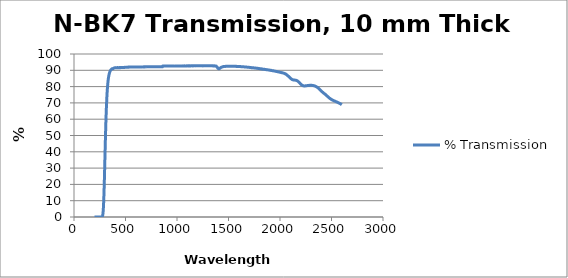
| Category | % Transmission |
|---|---|
| 2600.0 | 68.899 |
| 2599.0 | 68.944 |
| 2598.0 | 69.011 |
| 2597.0 | 69.037 |
| 2596.0 | 69.073 |
| 2595.0 | 69.112 |
| 2594.0 | 69.17 |
| 2593.0 | 69.196 |
| 2592.0 | 69.238 |
| 2591.0 | 69.243 |
| 2590.0 | 69.297 |
| 2589.0 | 69.358 |
| 2588.0 | 69.409 |
| 2587.0 | 69.429 |
| 2586.0 | 69.496 |
| 2585.0 | 69.52 |
| 2584.0 | 69.545 |
| 2583.0 | 69.556 |
| 2582.0 | 69.567 |
| 2581.0 | 69.654 |
| 2580.0 | 69.713 |
| 2579.0 | 69.743 |
| 2578.0 | 69.777 |
| 2577.0 | 69.791 |
| 2576.0 | 69.797 |
| 2575.0 | 69.844 |
| 2574.0 | 69.911 |
| 2573.0 | 69.915 |
| 2572.0 | 69.949 |
| 2571.0 | 69.978 |
| 2570.0 | 70.028 |
| 2569.0 | 70.069 |
| 2568.0 | 70.088 |
| 2567.0 | 70.12 |
| 2566.0 | 70.129 |
| 2565.0 | 70.155 |
| 2564.0 | 70.171 |
| 2563.0 | 70.21 |
| 2562.0 | 70.258 |
| 2561.0 | 70.281 |
| 2560.0 | 70.298 |
| 2559.0 | 70.32 |
| 2558.0 | 70.336 |
| 2557.0 | 70.367 |
| 2556.0 | 70.432 |
| 2555.0 | 70.452 |
| 2554.0 | 70.492 |
| 2553.0 | 70.54 |
| 2552.0 | 70.572 |
| 2551.0 | 70.587 |
| 2550.0 | 70.599 |
| 2549.0 | 70.648 |
| 2548.0 | 70.657 |
| 2547.0 | 70.681 |
| 2546.0 | 70.692 |
| 2545.0 | 70.735 |
| 2544.0 | 70.754 |
| 2543.0 | 70.807 |
| 2542.0 | 70.833 |
| 2541.0 | 70.86 |
| 2540.0 | 70.89 |
| 2539.0 | 70.928 |
| 2538.0 | 70.946 |
| 2537.0 | 70.984 |
| 2536.0 | 70.986 |
| 2535.0 | 70.996 |
| 2534.0 | 71.012 |
| 2533.0 | 71.074 |
| 2532.0 | 71.099 |
| 2531.0 | 71.144 |
| 2530.0 | 71.14 |
| 2529.0 | 71.148 |
| 2528.0 | 71.154 |
| 2527.0 | 71.216 |
| 2526.0 | 71.246 |
| 2525.0 | 71.287 |
| 2524.0 | 71.312 |
| 2523.0 | 71.324 |
| 2522.0 | 71.348 |
| 2521.0 | 71.401 |
| 2520.0 | 71.441 |
| 2519.0 | 71.459 |
| 2518.0 | 71.489 |
| 2517.0 | 71.504 |
| 2516.0 | 71.531 |
| 2515.0 | 71.567 |
| 2514.0 | 71.606 |
| 2513.0 | 71.631 |
| 2512.0 | 71.668 |
| 2511.0 | 71.688 |
| 2510.0 | 71.725 |
| 2509.0 | 71.755 |
| 2508.0 | 71.789 |
| 2507.0 | 71.819 |
| 2506.0 | 71.866 |
| 2505.0 | 71.917 |
| 2504.0 | 71.965 |
| 2503.0 | 71.998 |
| 2502.0 | 72.015 |
| 2501.0 | 72.044 |
| 2500.0 | 72.087 |
| 2499.0 | 72.117 |
| 2498.0 | 72.17 |
| 2497.0 | 72.187 |
| 2496.0 | 72.231 |
| 2495.0 | 72.28 |
| 2494.0 | 72.298 |
| 2493.0 | 72.361 |
| 2492.0 | 72.41 |
| 2491.0 | 72.463 |
| 2490.0 | 72.498 |
| 2489.0 | 72.529 |
| 2488.0 | 72.58 |
| 2487.0 | 72.635 |
| 2486.0 | 72.678 |
| 2485.0 | 72.712 |
| 2484.0 | 72.762 |
| 2483.0 | 72.806 |
| 2482.0 | 72.855 |
| 2481.0 | 72.91 |
| 2480.0 | 72.97 |
| 2479.0 | 73.017 |
| 2478.0 | 73.04 |
| 2477.0 | 73.088 |
| 2476.0 | 73.146 |
| 2475.0 | 73.208 |
| 2474.0 | 73.262 |
| 2473.0 | 73.314 |
| 2472.0 | 73.378 |
| 2471.0 | 73.419 |
| 2470.0 | 73.471 |
| 2469.0 | 73.541 |
| 2468.0 | 73.602 |
| 2467.0 | 73.673 |
| 2466.0 | 73.73 |
| 2465.0 | 73.771 |
| 2464.0 | 73.835 |
| 2463.0 | 73.905 |
| 2462.0 | 73.965 |
| 2461.0 | 74.02 |
| 2460.0 | 74.07 |
| 2459.0 | 74.114 |
| 2458.0 | 74.166 |
| 2457.0 | 74.227 |
| 2456.0 | 74.304 |
| 2455.0 | 74.383 |
| 2454.0 | 74.438 |
| 2453.0 | 74.484 |
| 2452.0 | 74.535 |
| 2451.0 | 74.593 |
| 2450.0 | 74.65 |
| 2449.0 | 74.7 |
| 2448.0 | 74.764 |
| 2447.0 | 74.812 |
| 2446.0 | 74.853 |
| 2445.0 | 74.915 |
| 2444.0 | 74.985 |
| 2443.0 | 75.031 |
| 2442.0 | 75.068 |
| 2441.0 | 75.124 |
| 2440.0 | 75.194 |
| 2439.0 | 75.266 |
| 2438.0 | 75.318 |
| 2437.0 | 75.351 |
| 2436.0 | 75.393 |
| 2435.0 | 75.438 |
| 2434.0 | 75.478 |
| 2433.0 | 75.524 |
| 2432.0 | 75.578 |
| 2431.0 | 75.641 |
| 2430.0 | 75.705 |
| 2429.0 | 75.772 |
| 2428.0 | 75.825 |
| 2427.0 | 75.852 |
| 2426.0 | 75.902 |
| 2425.0 | 75.98 |
| 2424.0 | 76.029 |
| 2423.0 | 76.059 |
| 2422.0 | 76.122 |
| 2421.0 | 76.188 |
| 2420.0 | 76.245 |
| 2419.0 | 76.29 |
| 2418.0 | 76.329 |
| 2417.0 | 76.385 |
| 2416.0 | 76.442 |
| 2415.0 | 76.51 |
| 2414.0 | 76.569 |
| 2413.0 | 76.609 |
| 2412.0 | 76.65 |
| 2411.0 | 76.703 |
| 2410.0 | 76.762 |
| 2409.0 | 76.827 |
| 2408.0 | 76.887 |
| 2407.0 | 76.945 |
| 2406.0 | 77.002 |
| 2405.0 | 77.059 |
| 2404.0 | 77.12 |
| 2403.0 | 77.175 |
| 2402.0 | 77.227 |
| 2401.0 | 77.286 |
| 2400.0 | 77.359 |
| 2399.0 | 77.431 |
| 2398.0 | 77.501 |
| 2397.0 | 77.559 |
| 2396.0 | 77.612 |
| 2395.0 | 77.674 |
| 2394.0 | 77.742 |
| 2393.0 | 77.811 |
| 2392.0 | 77.887 |
| 2391.0 | 77.966 |
| 2390.0 | 78.026 |
| 2389.0 | 78.071 |
| 2388.0 | 78.135 |
| 2387.0 | 78.202 |
| 2386.0 | 78.261 |
| 2385.0 | 78.317 |
| 2384.0 | 78.361 |
| 2383.0 | 78.422 |
| 2382.0 | 78.491 |
| 2381.0 | 78.569 |
| 2380.0 | 78.64 |
| 2379.0 | 78.7 |
| 2378.0 | 78.74 |
| 2377.0 | 78.778 |
| 2376.0 | 78.84 |
| 2375.0 | 78.927 |
| 2374.0 | 78.99 |
| 2373.0 | 79.04 |
| 2372.0 | 79.087 |
| 2371.0 | 79.136 |
| 2370.0 | 79.185 |
| 2369.0 | 79.235 |
| 2368.0 | 79.287 |
| 2367.0 | 79.325 |
| 2366.0 | 79.382 |
| 2365.0 | 79.444 |
| 2364.0 | 79.481 |
| 2363.0 | 79.506 |
| 2362.0 | 79.54 |
| 2361.0 | 79.584 |
| 2360.0 | 79.634 |
| 2359.0 | 79.674 |
| 2358.0 | 79.718 |
| 2357.0 | 79.763 |
| 2356.0 | 79.796 |
| 2355.0 | 79.82 |
| 2354.0 | 79.855 |
| 2353.0 | 79.907 |
| 2352.0 | 79.955 |
| 2351.0 | 79.988 |
| 2350.0 | 80.023 |
| 2349.0 | 80.073 |
| 2348.0 | 80.105 |
| 2347.0 | 80.14 |
| 2346.0 | 80.179 |
| 2345.0 | 80.191 |
| 2344.0 | 80.215 |
| 2343.0 | 80.239 |
| 2342.0 | 80.274 |
| 2341.0 | 80.311 |
| 2340.0 | 80.325 |
| 2339.0 | 80.332 |
| 2338.0 | 80.356 |
| 2337.0 | 80.395 |
| 2336.0 | 80.416 |
| 2335.0 | 80.446 |
| 2334.0 | 80.451 |
| 2333.0 | 80.459 |
| 2332.0 | 80.476 |
| 2331.0 | 80.507 |
| 2330.0 | 80.513 |
| 2329.0 | 80.538 |
| 2328.0 | 80.547 |
| 2327.0 | 80.562 |
| 2326.0 | 80.588 |
| 2325.0 | 80.601 |
| 2324.0 | 80.605 |
| 2323.0 | 80.622 |
| 2322.0 | 80.646 |
| 2321.0 | 80.638 |
| 2320.0 | 80.652 |
| 2319.0 | 80.664 |
| 2318.0 | 80.681 |
| 2317.0 | 80.7 |
| 2316.0 | 80.701 |
| 2315.0 | 80.708 |
| 2314.0 | 80.712 |
| 2313.0 | 80.728 |
| 2312.0 | 80.743 |
| 2311.0 | 80.762 |
| 2310.0 | 80.774 |
| 2309.0 | 80.788 |
| 2308.0 | 80.778 |
| 2307.0 | 80.778 |
| 2306.0 | 80.774 |
| 2305.0 | 80.766 |
| 2304.0 | 80.782 |
| 2303.0 | 80.776 |
| 2302.0 | 80.784 |
| 2301.0 | 80.791 |
| 2300.0 | 80.795 |
| 2299.0 | 80.782 |
| 2298.0 | 80.8 |
| 2297.0 | 80.796 |
| 2296.0 | 80.785 |
| 2295.0 | 80.775 |
| 2294.0 | 80.787 |
| 2293.0 | 80.799 |
| 2292.0 | 80.795 |
| 2291.0 | 80.795 |
| 2290.0 | 80.779 |
| 2289.0 | 80.771 |
| 2288.0 | 80.76 |
| 2287.0 | 80.748 |
| 2286.0 | 80.739 |
| 2285.0 | 80.734 |
| 2284.0 | 80.744 |
| 2283.0 | 80.757 |
| 2282.0 | 80.743 |
| 2281.0 | 80.752 |
| 2280.0 | 80.729 |
| 2279.0 | 80.714 |
| 2278.0 | 80.696 |
| 2277.0 | 80.692 |
| 2276.0 | 80.687 |
| 2275.0 | 80.689 |
| 2274.0 | 80.677 |
| 2273.0 | 80.646 |
| 2272.0 | 80.651 |
| 2271.0 | 80.656 |
| 2270.0 | 80.66 |
| 2269.0 | 80.647 |
| 2268.0 | 80.633 |
| 2267.0 | 80.63 |
| 2266.0 | 80.609 |
| 2265.0 | 80.61 |
| 2264.0 | 80.61 |
| 2263.0 | 80.591 |
| 2262.0 | 80.585 |
| 2261.0 | 80.567 |
| 2260.0 | 80.52 |
| 2259.0 | 80.561 |
| 2258.0 | 80.551 |
| 2257.0 | 80.537 |
| 2256.0 | 80.533 |
| 2255.0 | 80.521 |
| 2254.0 | 80.525 |
| 2253.0 | 80.496 |
| 2252.0 | 80.485 |
| 2251.0 | 80.47 |
| 2250.0 | 80.466 |
| 2249.0 | 80.446 |
| 2248.0 | 80.448 |
| 2247.0 | 80.47 |
| 2246.0 | 80.453 |
| 2245.0 | 80.434 |
| 2244.0 | 80.438 |
| 2243.0 | 80.423 |
| 2242.0 | 80.421 |
| 2241.0 | 80.408 |
| 2240.0 | 80.397 |
| 2239.0 | 80.398 |
| 2238.0 | 80.427 |
| 2237.0 | 80.409 |
| 2236.0 | 80.402 |
| 2235.0 | 80.416 |
| 2234.0 | 80.408 |
| 2233.0 | 80.407 |
| 2232.0 | 80.413 |
| 2231.0 | 80.467 |
| 2230.0 | 80.437 |
| 2229.0 | 80.472 |
| 2228.0 | 80.469 |
| 2227.0 | 80.468 |
| 2226.0 | 80.487 |
| 2225.0 | 80.514 |
| 2224.0 | 80.552 |
| 2223.0 | 80.565 |
| 2222.0 | 80.576 |
| 2221.0 | 80.61 |
| 2220.0 | 80.639 |
| 2219.0 | 80.654 |
| 2218.0 | 80.718 |
| 2217.0 | 80.771 |
| 2216.0 | 80.765 |
| 2215.0 | 80.822 |
| 2214.0 | 80.831 |
| 2213.0 | 80.877 |
| 2212.0 | 80.925 |
| 2211.0 | 80.98 |
| 2210.0 | 81.018 |
| 2209.0 | 81.07 |
| 2208.0 | 81.133 |
| 2207.0 | 81.206 |
| 2206.0 | 81.255 |
| 2205.0 | 81.296 |
| 2204.0 | 81.336 |
| 2203.0 | 81.4 |
| 2202.0 | 81.49 |
| 2201.0 | 81.55 |
| 2200.0 | 81.612 |
| 2199.0 | 81.675 |
| 2198.0 | 81.754 |
| 2197.0 | 81.795 |
| 2196.0 | 81.849 |
| 2195.0 | 81.939 |
| 2194.0 | 82.01 |
| 2193.0 | 82.074 |
| 2192.0 | 82.15 |
| 2191.0 | 82.188 |
| 2190.0 | 82.285 |
| 2189.0 | 82.338 |
| 2188.0 | 82.388 |
| 2187.0 | 82.462 |
| 2186.0 | 82.528 |
| 2185.0 | 82.591 |
| 2184.0 | 82.691 |
| 2183.0 | 82.728 |
| 2182.0 | 82.791 |
| 2181.0 | 82.862 |
| 2180.0 | 82.941 |
| 2179.0 | 82.996 |
| 2178.0 | 83.061 |
| 2177.0 | 83.104 |
| 2176.0 | 83.164 |
| 2175.0 | 83.213 |
| 2174.0 | 83.253 |
| 2173.0 | 83.311 |
| 2172.0 | 83.36 |
| 2171.0 | 83.409 |
| 2170.0 | 83.496 |
| 2169.0 | 83.505 |
| 2168.0 | 83.525 |
| 2167.0 | 83.561 |
| 2166.0 | 83.606 |
| 2165.0 | 83.637 |
| 2164.0 | 83.643 |
| 2163.0 | 83.684 |
| 2162.0 | 83.698 |
| 2161.0 | 83.753 |
| 2160.0 | 83.772 |
| 2159.0 | 83.782 |
| 2158.0 | 83.802 |
| 2157.0 | 83.805 |
| 2156.0 | 83.841 |
| 2155.0 | 83.865 |
| 2154.0 | 83.88 |
| 2153.0 | 83.888 |
| 2152.0 | 83.938 |
| 2151.0 | 83.933 |
| 2150.0 | 83.931 |
| 2149.0 | 83.931 |
| 2148.0 | 83.938 |
| 2147.0 | 83.96 |
| 2146.0 | 83.957 |
| 2145.0 | 83.981 |
| 2144.0 | 83.998 |
| 2143.0 | 84.013 |
| 2142.0 | 84.022 |
| 2141.0 | 84.015 |
| 2140.0 | 84.036 |
| 2139.0 | 84.059 |
| 2138.0 | 84.057 |
| 2137.0 | 84.067 |
| 2136.0 | 84.075 |
| 2135.0 | 84.078 |
| 2134.0 | 84.098 |
| 2133.0 | 84.095 |
| 2132.0 | 84.091 |
| 2131.0 | 84.089 |
| 2130.0 | 84.106 |
| 2129.0 | 84.122 |
| 2128.0 | 84.14 |
| 2127.0 | 84.147 |
| 2126.0 | 84.149 |
| 2125.0 | 84.182 |
| 2124.0 | 84.183 |
| 2123.0 | 84.214 |
| 2122.0 | 84.239 |
| 2121.0 | 84.261 |
| 2120.0 | 84.292 |
| 2119.0 | 84.306 |
| 2118.0 | 84.336 |
| 2117.0 | 84.363 |
| 2116.0 | 84.394 |
| 2115.0 | 84.448 |
| 2114.0 | 84.487 |
| 2113.0 | 84.518 |
| 2112.0 | 84.564 |
| 2111.0 | 84.633 |
| 2110.0 | 84.693 |
| 2109.0 | 84.747 |
| 2108.0 | 84.795 |
| 2107.0 | 84.868 |
| 2106.0 | 84.941 |
| 2105.0 | 84.983 |
| 2104.0 | 85.049 |
| 2103.0 | 85.106 |
| 2102.0 | 85.172 |
| 2101.0 | 85.248 |
| 2100.0 | 85.302 |
| 2099.0 | 85.359 |
| 2098.0 | 85.402 |
| 2097.0 | 85.462 |
| 2096.0 | 85.548 |
| 2095.0 | 85.591 |
| 2094.0 | 85.629 |
| 2093.0 | 85.685 |
| 2092.0 | 85.749 |
| 2091.0 | 85.806 |
| 2090.0 | 85.856 |
| 2089.0 | 85.918 |
| 2088.0 | 85.978 |
| 2087.0 | 86.027 |
| 2086.0 | 86.083 |
| 2085.0 | 86.123 |
| 2084.0 | 86.194 |
| 2083.0 | 86.251 |
| 2082.0 | 86.306 |
| 2081.0 | 86.374 |
| 2080.0 | 86.418 |
| 2079.0 | 86.471 |
| 2078.0 | 86.526 |
| 2077.0 | 86.601 |
| 2076.0 | 86.659 |
| 2075.0 | 86.707 |
| 2074.0 | 86.757 |
| 2073.0 | 86.813 |
| 2072.0 | 86.866 |
| 2071.0 | 86.944 |
| 2070.0 | 87.021 |
| 2069.0 | 87.069 |
| 2068.0 | 87.115 |
| 2067.0 | 87.167 |
| 2066.0 | 87.208 |
| 2065.0 | 87.246 |
| 2064.0 | 87.288 |
| 2063.0 | 87.333 |
| 2062.0 | 87.396 |
| 2061.0 | 87.444 |
| 2060.0 | 87.489 |
| 2059.0 | 87.556 |
| 2058.0 | 87.595 |
| 2057.0 | 87.625 |
| 2056.0 | 87.647 |
| 2055.0 | 87.688 |
| 2054.0 | 87.706 |
| 2053.0 | 87.733 |
| 2052.0 | 87.782 |
| 2051.0 | 87.832 |
| 2050.0 | 87.863 |
| 2049.0 | 87.874 |
| 2048.0 | 87.909 |
| 2047.0 | 87.955 |
| 2046.0 | 87.963 |
| 2045.0 | 87.987 |
| 2044.0 | 88.042 |
| 2043.0 | 88.07 |
| 2042.0 | 88.093 |
| 2041.0 | 88.131 |
| 2040.0 | 88.143 |
| 2039.0 | 88.17 |
| 2038.0 | 88.183 |
| 2037.0 | 88.196 |
| 2036.0 | 88.218 |
| 2035.0 | 88.232 |
| 2034.0 | 88.25 |
| 2033.0 | 88.281 |
| 2032.0 | 88.317 |
| 2031.0 | 88.333 |
| 2030.0 | 88.361 |
| 2029.0 | 88.371 |
| 2028.0 | 88.376 |
| 2027.0 | 88.404 |
| 2026.0 | 88.422 |
| 2025.0 | 88.445 |
| 2024.0 | 88.457 |
| 2023.0 | 88.456 |
| 2022.0 | 88.476 |
| 2021.0 | 88.477 |
| 2020.0 | 88.484 |
| 2019.0 | 88.509 |
| 2018.0 | 88.52 |
| 2017.0 | 88.549 |
| 2016.0 | 88.574 |
| 2015.0 | 88.581 |
| 2014.0 | 88.594 |
| 2013.0 | 88.603 |
| 2012.0 | 88.633 |
| 2011.0 | 88.669 |
| 2010.0 | 88.672 |
| 2009.0 | 88.67 |
| 2008.0 | 88.685 |
| 2007.0 | 88.704 |
| 2006.0 | 88.708 |
| 2005.0 | 88.714 |
| 2004.0 | 88.716 |
| 2003.0 | 88.734 |
| 2002.0 | 88.755 |
| 2001.0 | 88.767 |
| 2000.0 | 88.8 |
| 1999.0 | 88.827 |
| 1998.0 | 88.834 |
| 1997.0 | 88.842 |
| 1996.0 | 88.856 |
| 1995.0 | 88.873 |
| 1994.0 | 88.898 |
| 1993.0 | 88.911 |
| 1992.0 | 88.929 |
| 1991.0 | 88.951 |
| 1990.0 | 88.965 |
| 1989.0 | 88.96 |
| 1988.0 | 88.965 |
| 1987.0 | 88.985 |
| 1986.0 | 88.997 |
| 1985.0 | 89.026 |
| 1984.0 | 89.044 |
| 1983.0 | 89.043 |
| 1982.0 | 89.057 |
| 1981.0 | 89.066 |
| 1980.0 | 89.074 |
| 1979.0 | 89.097 |
| 1978.0 | 89.12 |
| 1977.0 | 89.129 |
| 1976.0 | 89.138 |
| 1975.0 | 89.164 |
| 1974.0 | 89.184 |
| 1973.0 | 89.189 |
| 1972.0 | 89.203 |
| 1971.0 | 89.217 |
| 1970.0 | 89.231 |
| 1969.0 | 89.234 |
| 1968.0 | 89.251 |
| 1967.0 | 89.273 |
| 1966.0 | 89.276 |
| 1965.0 | 89.308 |
| 1964.0 | 89.306 |
| 1963.0 | 89.311 |
| 1962.0 | 89.345 |
| 1961.0 | 89.359 |
| 1960.0 | 89.371 |
| 1959.0 | 89.395 |
| 1958.0 | 89.406 |
| 1957.0 | 89.399 |
| 1956.0 | 89.416 |
| 1955.0 | 89.449 |
| 1954.0 | 89.461 |
| 1953.0 | 89.487 |
| 1952.0 | 89.488 |
| 1951.0 | 89.495 |
| 1950.0 | 89.502 |
| 1949.0 | 89.52 |
| 1948.0 | 89.531 |
| 1947.0 | 89.538 |
| 1946.0 | 89.553 |
| 1945.0 | 89.564 |
| 1944.0 | 89.582 |
| 1943.0 | 89.582 |
| 1942.0 | 89.577 |
| 1941.0 | 89.595 |
| 1940.0 | 89.622 |
| 1939.0 | 89.675 |
| 1938.0 | 89.687 |
| 1937.0 | 89.685 |
| 1936.0 | 89.703 |
| 1935.0 | 89.698 |
| 1934.0 | 89.695 |
| 1933.0 | 89.753 |
| 1932.0 | 89.727 |
| 1931.0 | 89.761 |
| 1930.0 | 89.776 |
| 1929.0 | 89.757 |
| 1928.0 | 89.765 |
| 1927.0 | 89.773 |
| 1926.0 | 89.765 |
| 1925.0 | 89.775 |
| 1924.0 | 89.786 |
| 1923.0 | 89.81 |
| 1922.0 | 89.833 |
| 1921.0 | 89.854 |
| 1920.0 | 89.855 |
| 1919.0 | 89.875 |
| 1918.0 | 89.869 |
| 1917.0 | 89.892 |
| 1916.0 | 89.929 |
| 1915.0 | 89.947 |
| 1914.0 | 89.972 |
| 1913.0 | 89.967 |
| 1912.0 | 89.923 |
| 1911.0 | 89.944 |
| 1910.0 | 89.947 |
| 1909.0 | 89.978 |
| 1908.0 | 89.998 |
| 1907.0 | 90.066 |
| 1906.0 | 90.066 |
| 1905.0 | 90.06 |
| 1904.0 | 90.044 |
| 1903.0 | 90.024 |
| 1902.0 | 90.038 |
| 1901.0 | 90.057 |
| 1900.0 | 90.097 |
| 1899.0 | 90.108 |
| 1898.0 | 90.106 |
| 1897.0 | 90.118 |
| 1896.0 | 90.111 |
| 1895.0 | 90.132 |
| 1894.0 | 90.196 |
| 1893.0 | 90.206 |
| 1892.0 | 90.214 |
| 1891.0 | 90.173 |
| 1890.0 | 90.175 |
| 1889.0 | 90.168 |
| 1888.0 | 90.175 |
| 1887.0 | 90.235 |
| 1886.0 | 90.2 |
| 1885.0 | 90.214 |
| 1884.0 | 90.245 |
| 1883.0 | 90.264 |
| 1882.0 | 90.287 |
| 1881.0 | 90.269 |
| 1880.0 | 90.313 |
| 1879.0 | 90.261 |
| 1878.0 | 90.337 |
| 1877.0 | 90.356 |
| 1876.0 | 90.365 |
| 1875.0 | 90.367 |
| 1874.0 | 90.365 |
| 1873.0 | 90.358 |
| 1872.0 | 90.37 |
| 1871.0 | 90.372 |
| 1870.0 | 90.373 |
| 1869.0 | 90.376 |
| 1868.0 | 90.373 |
| 1867.0 | 90.401 |
| 1866.0 | 90.419 |
| 1865.0 | 90.393 |
| 1864.0 | 90.453 |
| 1863.0 | 90.477 |
| 1862.0 | 90.479 |
| 1861.0 | 90.491 |
| 1860.0 | 90.511 |
| 1859.0 | 90.502 |
| 1858.0 | 90.524 |
| 1857.0 | 90.496 |
| 1856.0 | 90.533 |
| 1855.0 | 90.527 |
| 1854.0 | 90.564 |
| 1853.0 | 90.564 |
| 1852.0 | 90.574 |
| 1851.0 | 90.547 |
| 1850.0 | 90.572 |
| 1849.0 | 90.623 |
| 1848.0 | 90.614 |
| 1847.0 | 90.621 |
| 1846.0 | 90.594 |
| 1845.0 | 90.603 |
| 1844.0 | 90.581 |
| 1843.0 | 90.614 |
| 1842.0 | 90.684 |
| 1841.0 | 90.71 |
| 1840.0 | 90.67 |
| 1839.0 | 90.624 |
| 1838.0 | 90.659 |
| 1837.0 | 90.688 |
| 1836.0 | 90.68 |
| 1835.0 | 90.708 |
| 1834.0 | 90.699 |
| 1833.0 | 90.72 |
| 1832.0 | 90.657 |
| 1831.0 | 90.7 |
| 1830.0 | 90.792 |
| 1829.0 | 90.795 |
| 1828.0 | 90.803 |
| 1827.0 | 90.802 |
| 1826.0 | 90.822 |
| 1825.0 | 90.788 |
| 1824.0 | 90.823 |
| 1823.0 | 90.819 |
| 1822.0 | 90.869 |
| 1821.0 | 90.875 |
| 1820.0 | 90.884 |
| 1819.0 | 90.845 |
| 1818.0 | 90.862 |
| 1817.0 | 90.851 |
| 1816.0 | 90.879 |
| 1815.0 | 90.884 |
| 1814.0 | 90.906 |
| 1813.0 | 90.92 |
| 1812.0 | 90.932 |
| 1811.0 | 90.918 |
| 1810.0 | 90.929 |
| 1809.0 | 90.912 |
| 1808.0 | 90.963 |
| 1807.0 | 90.978 |
| 1806.0 | 90.991 |
| 1805.0 | 90.986 |
| 1804.0 | 90.997 |
| 1803.0 | 91.01 |
| 1802.0 | 91.03 |
| 1801.0 | 90.995 |
| 1800.0 | 91.046 |
| 1799.0 | 91.043 |
| 1798.0 | 91.057 |
| 1797.0 | 91.066 |
| 1796.0 | 91.084 |
| 1795.0 | 91.063 |
| 1794.0 | 91.06 |
| 1793.0 | 91.084 |
| 1792.0 | 91.096 |
| 1791.0 | 91.097 |
| 1790.0 | 91.126 |
| 1789.0 | 91.156 |
| 1788.0 | 91.151 |
| 1787.0 | 91.18 |
| 1786.0 | 91.192 |
| 1785.0 | 91.188 |
| 1784.0 | 91.189 |
| 1783.0 | 91.17 |
| 1782.0 | 91.18 |
| 1781.0 | 91.179 |
| 1780.0 | 91.217 |
| 1779.0 | 91.238 |
| 1778.0 | 91.231 |
| 1777.0 | 91.244 |
| 1776.0 | 91.23 |
| 1775.0 | 91.244 |
| 1774.0 | 91.261 |
| 1773.0 | 91.271 |
| 1772.0 | 91.265 |
| 1771.0 | 91.263 |
| 1770.0 | 91.286 |
| 1769.0 | 91.304 |
| 1768.0 | 91.304 |
| 1767.0 | 91.318 |
| 1766.0 | 91.354 |
| 1765.0 | 91.354 |
| 1764.0 | 91.355 |
| 1763.0 | 91.36 |
| 1762.0 | 91.362 |
| 1761.0 | 91.36 |
| 1760.0 | 91.355 |
| 1759.0 | 91.359 |
| 1758.0 | 91.374 |
| 1757.0 | 91.395 |
| 1756.0 | 91.384 |
| 1755.0 | 91.412 |
| 1754.0 | 91.421 |
| 1753.0 | 91.43 |
| 1752.0 | 91.457 |
| 1751.0 | 91.463 |
| 1750.0 | 91.476 |
| 1749.0 | 91.464 |
| 1748.0 | 91.477 |
| 1747.0 | 91.485 |
| 1746.0 | 91.483 |
| 1745.0 | 91.499 |
| 1744.0 | 91.507 |
| 1743.0 | 91.525 |
| 1742.0 | 91.516 |
| 1741.0 | 91.504 |
| 1740.0 | 91.511 |
| 1739.0 | 91.516 |
| 1738.0 | 91.527 |
| 1737.0 | 91.53 |
| 1736.0 | 91.53 |
| 1735.0 | 91.547 |
| 1734.0 | 91.556 |
| 1733.0 | 91.564 |
| 1732.0 | 91.585 |
| 1731.0 | 91.591 |
| 1730.0 | 91.588 |
| 1729.0 | 91.578 |
| 1728.0 | 91.593 |
| 1727.0 | 91.596 |
| 1726.0 | 91.599 |
| 1725.0 | 91.603 |
| 1724.0 | 91.606 |
| 1723.0 | 91.633 |
| 1722.0 | 91.627 |
| 1721.0 | 91.638 |
| 1720.0 | 91.658 |
| 1719.0 | 91.672 |
| 1718.0 | 91.674 |
| 1717.0 | 91.682 |
| 1716.0 | 91.689 |
| 1715.0 | 91.689 |
| 1714.0 | 91.696 |
| 1713.0 | 91.71 |
| 1712.0 | 91.726 |
| 1711.0 | 91.732 |
| 1710.0 | 91.743 |
| 1709.0 | 91.756 |
| 1708.0 | 91.75 |
| 1707.0 | 91.77 |
| 1706.0 | 91.793 |
| 1705.0 | 91.78 |
| 1704.0 | 91.784 |
| 1703.0 | 91.787 |
| 1702.0 | 91.799 |
| 1701.0 | 91.8 |
| 1700.0 | 91.8 |
| 1699.0 | 91.803 |
| 1698.0 | 91.812 |
| 1697.0 | 91.816 |
| 1696.0 | 91.82 |
| 1695.0 | 91.83 |
| 1694.0 | 91.835 |
| 1693.0 | 91.858 |
| 1692.0 | 91.875 |
| 1691.0 | 91.87 |
| 1690.0 | 91.874 |
| 1689.0 | 91.896 |
| 1688.0 | 91.906 |
| 1687.0 | 91.911 |
| 1686.0 | 91.904 |
| 1685.0 | 91.898 |
| 1684.0 | 91.899 |
| 1683.0 | 91.914 |
| 1682.0 | 91.924 |
| 1681.0 | 91.939 |
| 1680.0 | 91.938 |
| 1679.0 | 91.942 |
| 1678.0 | 91.957 |
| 1677.0 | 91.963 |
| 1676.0 | 91.97 |
| 1675.0 | 91.981 |
| 1674.0 | 91.985 |
| 1673.0 | 91.995 |
| 1672.0 | 92.007 |
| 1671.0 | 92.011 |
| 1670.0 | 92.018 |
| 1669.0 | 92.022 |
| 1668.0 | 92.014 |
| 1667.0 | 92.006 |
| 1666.0 | 91.999 |
| 1665.0 | 92.002 |
| 1664.0 | 92.014 |
| 1663.0 | 92.024 |
| 1662.0 | 92.021 |
| 1661.0 | 92.026 |
| 1660.0 | 92.047 |
| 1659.0 | 92.055 |
| 1658.0 | 92.041 |
| 1657.0 | 92.058 |
| 1656.0 | 92.067 |
| 1655.0 | 92.073 |
| 1654.0 | 92.093 |
| 1653.0 | 92.09 |
| 1652.0 | 92.09 |
| 1651.0 | 92.095 |
| 1650.0 | 92.121 |
| 1649.0 | 92.136 |
| 1648.0 | 92.135 |
| 1647.0 | 92.124 |
| 1646.0 | 92.142 |
| 1645.0 | 92.158 |
| 1644.0 | 92.152 |
| 1643.0 | 92.141 |
| 1642.0 | 92.133 |
| 1641.0 | 92.146 |
| 1640.0 | 92.163 |
| 1639.0 | 92.169 |
| 1638.0 | 92.146 |
| 1637.0 | 92.157 |
| 1636.0 | 92.194 |
| 1635.0 | 92.205 |
| 1634.0 | 92.189 |
| 1633.0 | 92.16 |
| 1632.0 | 92.157 |
| 1631.0 | 92.184 |
| 1630.0 | 92.204 |
| 1629.0 | 92.221 |
| 1628.0 | 92.229 |
| 1627.0 | 92.217 |
| 1626.0 | 92.222 |
| 1625.0 | 92.229 |
| 1624.0 | 92.221 |
| 1623.0 | 92.225 |
| 1622.0 | 92.229 |
| 1621.0 | 92.227 |
| 1620.0 | 92.239 |
| 1619.0 | 92.253 |
| 1618.0 | 92.268 |
| 1617.0 | 92.278 |
| 1616.0 | 92.26 |
| 1615.0 | 92.262 |
| 1614.0 | 92.276 |
| 1613.0 | 92.278 |
| 1612.0 | 92.273 |
| 1611.0 | 92.254 |
| 1610.0 | 92.26 |
| 1609.0 | 92.265 |
| 1608.0 | 92.264 |
| 1607.0 | 92.263 |
| 1606.0 | 92.272 |
| 1605.0 | 92.287 |
| 1604.0 | 92.294 |
| 1603.0 | 92.305 |
| 1602.0 | 92.313 |
| 1601.0 | 92.319 |
| 1600.0 | 92.321 |
| 1599.0 | 92.325 |
| 1598.0 | 92.322 |
| 1597.0 | 92.324 |
| 1596.0 | 92.315 |
| 1595.0 | 92.294 |
| 1594.0 | 92.306 |
| 1593.0 | 92.33 |
| 1592.0 | 92.333 |
| 1591.0 | 92.325 |
| 1590.0 | 92.366 |
| 1589.0 | 92.376 |
| 1588.0 | 92.369 |
| 1587.0 | 92.367 |
| 1586.0 | 92.355 |
| 1585.0 | 92.346 |
| 1584.0 | 92.362 |
| 1583.0 | 92.365 |
| 1582.0 | 92.38 |
| 1581.0 | 92.395 |
| 1580.0 | 92.379 |
| 1579.0 | 92.406 |
| 1578.0 | 92.429 |
| 1577.0 | 92.398 |
| 1576.0 | 92.416 |
| 1575.0 | 92.426 |
| 1574.0 | 92.414 |
| 1573.0 | 92.388 |
| 1572.0 | 92.413 |
| 1571.0 | 92.414 |
| 1570.0 | 92.428 |
| 1569.0 | 92.417 |
| 1568.0 | 92.419 |
| 1567.0 | 92.424 |
| 1566.0 | 92.431 |
| 1565.0 | 92.434 |
| 1564.0 | 92.415 |
| 1563.0 | 92.416 |
| 1562.0 | 92.411 |
| 1561.0 | 92.437 |
| 1560.0 | 92.423 |
| 1559.0 | 92.423 |
| 1558.0 | 92.448 |
| 1557.0 | 92.451 |
| 1556.0 | 92.437 |
| 1555.0 | 92.436 |
| 1554.0 | 92.447 |
| 1553.0 | 92.439 |
| 1552.0 | 92.424 |
| 1551.0 | 92.449 |
| 1550.0 | 92.465 |
| 1549.0 | 92.451 |
| 1548.0 | 92.475 |
| 1547.0 | 92.462 |
| 1546.0 | 92.454 |
| 1545.0 | 92.446 |
| 1544.0 | 92.454 |
| 1543.0 | 92.442 |
| 1542.0 | 92.428 |
| 1541.0 | 92.468 |
| 1540.0 | 92.496 |
| 1539.0 | 92.495 |
| 1538.0 | 92.473 |
| 1537.0 | 92.457 |
| 1536.0 | 92.451 |
| 1535.0 | 92.454 |
| 1534.0 | 92.449 |
| 1533.0 | 92.458 |
| 1532.0 | 92.461 |
| 1531.0 | 92.472 |
| 1530.0 | 92.477 |
| 1529.0 | 92.494 |
| 1528.0 | 92.484 |
| 1527.0 | 92.475 |
| 1526.0 | 92.474 |
| 1525.0 | 92.461 |
| 1524.0 | 92.447 |
| 1523.0 | 92.459 |
| 1522.0 | 92.466 |
| 1521.0 | 92.512 |
| 1520.0 | 92.528 |
| 1519.0 | 92.461 |
| 1518.0 | 92.477 |
| 1517.0 | 92.485 |
| 1516.0 | 92.491 |
| 1515.0 | 92.467 |
| 1514.0 | 92.488 |
| 1513.0 | 92.475 |
| 1512.0 | 92.449 |
| 1511.0 | 92.474 |
| 1510.0 | 92.491 |
| 1509.0 | 92.486 |
| 1508.0 | 92.473 |
| 1507.0 | 92.465 |
| 1506.0 | 92.477 |
| 1505.0 | 92.47 |
| 1504.0 | 92.515 |
| 1503.0 | 92.501 |
| 1502.0 | 92.451 |
| 1501.0 | 92.455 |
| 1500.0 | 92.463 |
| 1499.0 | 92.503 |
| 1498.0 | 92.463 |
| 1497.0 | 92.464 |
| 1496.0 | 92.463 |
| 1495.0 | 92.454 |
| 1494.0 | 92.45 |
| 1493.0 | 92.447 |
| 1492.0 | 92.419 |
| 1491.0 | 92.433 |
| 1490.0 | 92.453 |
| 1489.0 | 92.454 |
| 1488.0 | 92.446 |
| 1487.0 | 92.447 |
| 1486.0 | 92.45 |
| 1485.0 | 92.417 |
| 1484.0 | 92.447 |
| 1483.0 | 92.441 |
| 1482.0 | 92.432 |
| 1481.0 | 92.419 |
| 1480.0 | 92.433 |
| 1479.0 | 92.446 |
| 1478.0 | 92.419 |
| 1477.0 | 92.434 |
| 1476.0 | 92.408 |
| 1475.0 | 92.425 |
| 1474.0 | 92.431 |
| 1473.0 | 92.401 |
| 1472.0 | 92.408 |
| 1471.0 | 92.424 |
| 1470.0 | 92.382 |
| 1469.0 | 92.4 |
| 1468.0 | 92.383 |
| 1467.0 | 92.375 |
| 1466.0 | 92.378 |
| 1465.0 | 92.371 |
| 1464.0 | 92.353 |
| 1463.0 | 92.328 |
| 1462.0 | 92.357 |
| 1461.0 | 92.32 |
| 1460.0 | 92.313 |
| 1459.0 | 92.294 |
| 1458.0 | 92.283 |
| 1457.0 | 92.316 |
| 1456.0 | 92.31 |
| 1455.0 | 92.279 |
| 1454.0 | 92.284 |
| 1453.0 | 92.302 |
| 1452.0 | 92.261 |
| 1451.0 | 92.283 |
| 1450.0 | 92.263 |
| 1449.0 | 92.241 |
| 1448.0 | 92.256 |
| 1447.0 | 92.186 |
| 1446.0 | 92.186 |
| 1445.0 | 92.166 |
| 1444.0 | 92.177 |
| 1443.0 | 92.133 |
| 1442.0 | 92.134 |
| 1441.0 | 92.148 |
| 1440.0 | 92.099 |
| 1439.0 | 92.054 |
| 1438.0 | 92.021 |
| 1437.0 | 92.025 |
| 1436.0 | 92.005 |
| 1435.0 | 91.97 |
| 1434.0 | 91.944 |
| 1433.0 | 91.942 |
| 1432.0 | 91.905 |
| 1431.0 | 91.859 |
| 1430.0 | 91.826 |
| 1429.0 | 91.781 |
| 1428.0 | 91.755 |
| 1427.0 | 91.736 |
| 1426.0 | 91.702 |
| 1425.0 | 91.665 |
| 1424.0 | 91.618 |
| 1423.0 | 91.568 |
| 1422.0 | 91.488 |
| 1421.0 | 91.427 |
| 1420.0 | 91.393 |
| 1419.0 | 91.37 |
| 1418.0 | 91.319 |
| 1417.0 | 91.283 |
| 1416.0 | 91.24 |
| 1415.0 | 91.205 |
| 1414.0 | 91.149 |
| 1413.0 | 91.114 |
| 1412.0 | 91.062 |
| 1411.0 | 91.011 |
| 1410.0 | 90.964 |
| 1409.0 | 90.973 |
| 1408.0 | 90.959 |
| 1407.0 | 90.919 |
| 1406.0 | 90.93 |
| 1405.0 | 90.945 |
| 1404.0 | 90.966 |
| 1403.0 | 90.977 |
| 1402.0 | 91.016 |
| 1401.0 | 91.053 |
| 1400.0 | 91.191 |
| 1399.0 | 91.132 |
| 1398.0 | 91.161 |
| 1397.0 | 91.291 |
| 1396.0 | 91.394 |
| 1395.0 | 91.552 |
| 1394.0 | 91.57 |
| 1393.0 | 91.617 |
| 1392.0 | 91.711 |
| 1391.0 | 91.822 |
| 1390.0 | 91.918 |
| 1389.0 | 92.002 |
| 1388.0 | 92.105 |
| 1387.0 | 92.183 |
| 1386.0 | 92.233 |
| 1385.0 | 92.246 |
| 1384.0 | 92.337 |
| 1383.0 | 92.362 |
| 1382.0 | 92.518 |
| 1381.0 | 92.616 |
| 1380.0 | 92.506 |
| 1379.0 | 92.464 |
| 1378.0 | 92.555 |
| 1377.0 | 92.505 |
| 1376.0 | 92.566 |
| 1375.0 | 92.665 |
| 1374.0 | 92.651 |
| 1373.0 | 92.666 |
| 1372.0 | 92.681 |
| 1371.0 | 92.682 |
| 1370.0 | 92.668 |
| 1369.0 | 92.653 |
| 1368.0 | 92.697 |
| 1367.0 | 92.694 |
| 1366.0 | 92.703 |
| 1365.0 | 92.721 |
| 1364.0 | 92.728 |
| 1363.0 | 92.743 |
| 1362.0 | 92.721 |
| 1361.0 | 92.702 |
| 1360.0 | 92.685 |
| 1359.0 | 92.708 |
| 1358.0 | 92.713 |
| 1357.0 | 92.71 |
| 1356.0 | 92.705 |
| 1355.0 | 92.721 |
| 1354.0 | 92.739 |
| 1353.0 | 92.761 |
| 1352.0 | 92.711 |
| 1351.0 | 92.698 |
| 1350.0 | 92.665 |
| 1349.0 | 92.702 |
| 1348.0 | 92.721 |
| 1347.0 | 92.733 |
| 1346.0 | 92.756 |
| 1345.0 | 92.776 |
| 1344.0 | 92.732 |
| 1343.0 | 92.73 |
| 1342.0 | 92.728 |
| 1341.0 | 92.722 |
| 1340.0 | 92.731 |
| 1339.0 | 92.751 |
| 1338.0 | 92.741 |
| 1337.0 | 92.732 |
| 1336.0 | 92.746 |
| 1335.0 | 92.745 |
| 1334.0 | 92.731 |
| 1333.0 | 92.728 |
| 1332.0 | 92.734 |
| 1331.0 | 92.733 |
| 1330.0 | 92.723 |
| 1329.0 | 92.722 |
| 1328.0 | 92.753 |
| 1327.0 | 92.754 |
| 1326.0 | 92.733 |
| 1325.0 | 92.713 |
| 1324.0 | 92.719 |
| 1323.0 | 92.738 |
| 1322.0 | 92.749 |
| 1321.0 | 92.756 |
| 1320.0 | 92.752 |
| 1319.0 | 92.749 |
| 1318.0 | 92.752 |
| 1317.0 | 92.752 |
| 1316.0 | 92.751 |
| 1315.0 | 92.753 |
| 1314.0 | 92.765 |
| 1313.0 | 92.753 |
| 1312.0 | 92.758 |
| 1311.0 | 92.776 |
| 1310.0 | 92.756 |
| 1309.0 | 92.747 |
| 1308.0 | 92.758 |
| 1307.0 | 92.775 |
| 1306.0 | 92.763 |
| 1305.0 | 92.744 |
| 1304.0 | 92.764 |
| 1303.0 | 92.783 |
| 1302.0 | 92.782 |
| 1301.0 | 92.797 |
| 1300.0 | 92.788 |
| 1299.0 | 92.781 |
| 1298.0 | 92.79 |
| 1297.0 | 92.775 |
| 1296.0 | 92.766 |
| 1295.0 | 92.768 |
| 1294.0 | 92.768 |
| 1293.0 | 92.776 |
| 1292.0 | 92.791 |
| 1291.0 | 92.806 |
| 1290.0 | 92.789 |
| 1289.0 | 92.769 |
| 1288.0 | 92.75 |
| 1287.0 | 92.758 |
| 1286.0 | 92.772 |
| 1285.0 | 92.765 |
| 1284.0 | 92.745 |
| 1283.0 | 92.753 |
| 1282.0 | 92.759 |
| 1281.0 | 92.745 |
| 1280.0 | 92.747 |
| 1279.0 | 92.758 |
| 1278.0 | 92.765 |
| 1277.0 | 92.774 |
| 1276.0 | 92.755 |
| 1275.0 | 92.743 |
| 1274.0 | 92.751 |
| 1273.0 | 92.747 |
| 1272.0 | 92.743 |
| 1271.0 | 92.743 |
| 1270.0 | 92.756 |
| 1269.0 | 92.766 |
| 1268.0 | 92.772 |
| 1267.0 | 92.771 |
| 1266.0 | 92.758 |
| 1265.0 | 92.755 |
| 1264.0 | 92.77 |
| 1263.0 | 92.769 |
| 1262.0 | 92.759 |
| 1261.0 | 92.755 |
| 1260.0 | 92.776 |
| 1259.0 | 92.762 |
| 1258.0 | 92.72 |
| 1257.0 | 92.704 |
| 1256.0 | 92.718 |
| 1255.0 | 92.731 |
| 1254.0 | 92.741 |
| 1253.0 | 92.756 |
| 1252.0 | 92.745 |
| 1251.0 | 92.741 |
| 1250.0 | 92.723 |
| 1249.0 | 92.698 |
| 1248.0 | 92.713 |
| 1247.0 | 92.734 |
| 1246.0 | 92.74 |
| 1245.0 | 92.755 |
| 1244.0 | 92.753 |
| 1243.0 | 92.754 |
| 1242.0 | 92.768 |
| 1241.0 | 92.739 |
| 1240.0 | 92.753 |
| 1239.0 | 92.759 |
| 1238.0 | 92.739 |
| 1237.0 | 92.736 |
| 1236.0 | 92.736 |
| 1235.0 | 92.731 |
| 1234.0 | 92.743 |
| 1233.0 | 92.742 |
| 1232.0 | 92.741 |
| 1231.0 | 92.741 |
| 1230.0 | 92.74 |
| 1229.0 | 92.739 |
| 1228.0 | 92.762 |
| 1227.0 | 92.745 |
| 1226.0 | 92.732 |
| 1225.0 | 92.72 |
| 1224.0 | 92.738 |
| 1223.0 | 92.753 |
| 1222.0 | 92.737 |
| 1221.0 | 92.733 |
| 1220.0 | 92.75 |
| 1219.0 | 92.739 |
| 1218.0 | 92.739 |
| 1217.0 | 92.724 |
| 1216.0 | 92.724 |
| 1215.0 | 92.718 |
| 1214.0 | 92.723 |
| 1213.0 | 92.739 |
| 1212.0 | 92.732 |
| 1211.0 | 92.728 |
| 1210.0 | 92.731 |
| 1209.0 | 92.737 |
| 1208.0 | 92.726 |
| 1207.0 | 92.735 |
| 1206.0 | 92.757 |
| 1205.0 | 92.755 |
| 1204.0 | 92.755 |
| 1203.0 | 92.739 |
| 1202.0 | 92.75 |
| 1201.0 | 92.746 |
| 1200.0 | 92.742 |
| 1199.0 | 92.733 |
| 1198.0 | 92.742 |
| 1197.0 | 92.752 |
| 1196.0 | 92.738 |
| 1195.0 | 92.745 |
| 1194.0 | 92.731 |
| 1193.0 | 92.722 |
| 1192.0 | 92.738 |
| 1191.0 | 92.739 |
| 1190.0 | 92.742 |
| 1189.0 | 92.761 |
| 1188.0 | 92.755 |
| 1187.0 | 92.738 |
| 1186.0 | 92.741 |
| 1185.0 | 92.73 |
| 1184.0 | 92.717 |
| 1183.0 | 92.702 |
| 1182.0 | 92.735 |
| 1181.0 | 92.743 |
| 1180.0 | 92.732 |
| 1179.0 | 92.754 |
| 1178.0 | 92.748 |
| 1177.0 | 92.735 |
| 1176.0 | 92.738 |
| 1175.0 | 92.722 |
| 1174.0 | 92.732 |
| 1173.0 | 92.74 |
| 1172.0 | 92.74 |
| 1171.0 | 92.746 |
| 1170.0 | 92.75 |
| 1169.0 | 92.748 |
| 1168.0 | 92.753 |
| 1167.0 | 92.735 |
| 1166.0 | 92.728 |
| 1165.0 | 92.734 |
| 1164.0 | 92.745 |
| 1163.0 | 92.744 |
| 1162.0 | 92.738 |
| 1161.0 | 92.731 |
| 1160.0 | 92.706 |
| 1159.0 | 92.725 |
| 1158.0 | 92.735 |
| 1157.0 | 92.714 |
| 1156.0 | 92.702 |
| 1155.0 | 92.719 |
| 1154.0 | 92.724 |
| 1153.0 | 92.716 |
| 1152.0 | 92.732 |
| 1151.0 | 92.726 |
| 1150.0 | 92.713 |
| 1149.0 | 92.7 |
| 1148.0 | 92.719 |
| 1147.0 | 92.745 |
| 1146.0 | 92.752 |
| 1145.0 | 92.726 |
| 1144.0 | 92.726 |
| 1143.0 | 92.728 |
| 1142.0 | 92.729 |
| 1141.0 | 92.712 |
| 1140.0 | 92.715 |
| 1139.0 | 92.737 |
| 1138.0 | 92.732 |
| 1137.0 | 92.716 |
| 1136.0 | 92.702 |
| 1135.0 | 92.668 |
| 1134.0 | 92.7 |
| 1133.0 | 92.71 |
| 1132.0 | 92.716 |
| 1131.0 | 92.725 |
| 1130.0 | 92.701 |
| 1129.0 | 92.721 |
| 1128.0 | 92.713 |
| 1127.0 | 92.71 |
| 1126.0 | 92.69 |
| 1125.0 | 92.699 |
| 1124.0 | 92.722 |
| 1123.0 | 92.723 |
| 1122.0 | 92.7 |
| 1121.0 | 92.717 |
| 1120.0 | 92.723 |
| 1119.0 | 92.727 |
| 1118.0 | 92.72 |
| 1117.0 | 92.736 |
| 1116.0 | 92.697 |
| 1115.0 | 92.716 |
| 1114.0 | 92.701 |
| 1113.0 | 92.723 |
| 1112.0 | 92.707 |
| 1111.0 | 92.722 |
| 1110.0 | 92.709 |
| 1109.0 | 92.703 |
| 1108.0 | 92.712 |
| 1107.0 | 92.724 |
| 1106.0 | 92.721 |
| 1105.0 | 92.726 |
| 1104.0 | 92.723 |
| 1103.0 | 92.723 |
| 1102.0 | 92.712 |
| 1101.0 | 92.691 |
| 1100.0 | 92.721 |
| 1099.0 | 92.694 |
| 1098.0 | 92.695 |
| 1097.0 | 92.696 |
| 1096.0 | 92.684 |
| 1095.0 | 92.711 |
| 1094.0 | 92.7 |
| 1093.0 | 92.724 |
| 1092.0 | 92.699 |
| 1091.0 | 92.704 |
| 1090.0 | 92.688 |
| 1089.0 | 92.724 |
| 1088.0 | 92.711 |
| 1087.0 | 92.689 |
| 1086.0 | 92.695 |
| 1085.0 | 92.71 |
| 1084.0 | 92.673 |
| 1083.0 | 92.689 |
| 1082.0 | 92.705 |
| 1081.0 | 92.699 |
| 1080.0 | 92.696 |
| 1079.0 | 92.681 |
| 1078.0 | 92.684 |
| 1077.0 | 92.709 |
| 1076.0 | 92.689 |
| 1075.0 | 92.703 |
| 1074.0 | 92.718 |
| 1073.0 | 92.726 |
| 1072.0 | 92.696 |
| 1071.0 | 92.731 |
| 1070.0 | 92.707 |
| 1069.0 | 92.733 |
| 1068.0 | 92.693 |
| 1067.0 | 92.708 |
| 1066.0 | 92.703 |
| 1065.0 | 92.682 |
| 1064.0 | 92.685 |
| 1063.0 | 92.702 |
| 1062.0 | 92.669 |
| 1061.0 | 92.689 |
| 1060.0 | 92.701 |
| 1059.0 | 92.694 |
| 1058.0 | 92.692 |
| 1057.0 | 92.69 |
| 1056.0 | 92.692 |
| 1055.0 | 92.691 |
| 1054.0 | 92.689 |
| 1053.0 | 92.709 |
| 1052.0 | 92.714 |
| 1051.0 | 92.693 |
| 1050.0 | 92.674 |
| 1049.0 | 92.673 |
| 1048.0 | 92.682 |
| 1047.0 | 92.677 |
| 1046.0 | 92.678 |
| 1045.0 | 92.661 |
| 1044.0 | 92.663 |
| 1043.0 | 92.668 |
| 1042.0 | 92.665 |
| 1041.0 | 92.67 |
| 1040.0 | 92.691 |
| 1039.0 | 92.672 |
| 1038.0 | 92.706 |
| 1037.0 | 92.692 |
| 1036.0 | 92.688 |
| 1035.0 | 92.705 |
| 1034.0 | 92.681 |
| 1033.0 | 92.673 |
| 1032.0 | 92.636 |
| 1031.0 | 92.661 |
| 1030.0 | 92.662 |
| 1029.0 | 92.669 |
| 1028.0 | 92.672 |
| 1027.0 | 92.708 |
| 1026.0 | 92.653 |
| 1025.0 | 92.695 |
| 1024.0 | 92.665 |
| 1023.0 | 92.676 |
| 1022.0 | 92.663 |
| 1021.0 | 92.667 |
| 1020.0 | 92.673 |
| 1019.0 | 92.649 |
| 1018.0 | 92.65 |
| 1017.0 | 92.662 |
| 1016.0 | 92.663 |
| 1015.0 | 92.671 |
| 1014.0 | 92.692 |
| 1013.0 | 92.673 |
| 1012.0 | 92.677 |
| 1011.0 | 92.674 |
| 1010.0 | 92.659 |
| 1009.0 | 92.645 |
| 1008.0 | 92.64 |
| 1007.0 | 92.669 |
| 1006.0 | 92.666 |
| 1005.0 | 92.663 |
| 1004.0 | 92.673 |
| 1003.0 | 92.686 |
| 1002.0 | 92.648 |
| 1001.0 | 92.651 |
| 1000.0 | 92.665 |
| 999.0 | 92.664 |
| 998.0 | 92.649 |
| 997.0 | 92.659 |
| 996.0 | 92.648 |
| 995.0 | 92.65 |
| 994.0 | 92.644 |
| 993.0 | 92.689 |
| 992.0 | 92.662 |
| 991.0 | 92.649 |
| 990.0 | 92.671 |
| 989.0 | 92.664 |
| 988.0 | 92.647 |
| 987.0 | 92.63 |
| 986.0 | 92.612 |
| 985.0 | 92.649 |
| 984.0 | 92.631 |
| 983.0 | 92.635 |
| 982.0 | 92.605 |
| 981.0 | 92.611 |
| 980.0 | 92.611 |
| 979.0 | 92.636 |
| 978.0 | 92.628 |
| 977.0 | 92.638 |
| 976.0 | 92.644 |
| 975.0 | 92.648 |
| 974.0 | 92.602 |
| 973.0 | 92.632 |
| 972.0 | 92.639 |
| 971.0 | 92.641 |
| 970.0 | 92.621 |
| 969.0 | 92.614 |
| 968.0 | 92.609 |
| 967.0 | 92.619 |
| 966.0 | 92.64 |
| 965.0 | 92.606 |
| 964.0 | 92.584 |
| 963.0 | 92.596 |
| 962.0 | 92.604 |
| 961.0 | 92.615 |
| 960.0 | 92.6 |
| 959.0 | 92.577 |
| 958.0 | 92.578 |
| 957.0 | 92.606 |
| 956.0 | 92.592 |
| 955.0 | 92.58 |
| 954.0 | 92.608 |
| 953.0 | 92.601 |
| 952.0 | 92.604 |
| 951.0 | 92.588 |
| 950.0 | 92.593 |
| 949.0 | 92.62 |
| 948.0 | 92.643 |
| 947.0 | 92.609 |
| 946.0 | 92.61 |
| 945.0 | 92.627 |
| 944.0 | 92.625 |
| 943.0 | 92.625 |
| 942.0 | 92.582 |
| 941.0 | 92.61 |
| 940.0 | 92.617 |
| 939.0 | 92.646 |
| 938.0 | 92.625 |
| 937.0 | 92.602 |
| 936.0 | 92.6 |
| 935.0 | 92.63 |
| 934.0 | 92.659 |
| 933.0 | 92.642 |
| 932.0 | 92.626 |
| 931.0 | 92.646 |
| 930.0 | 92.652 |
| 929.0 | 92.627 |
| 928.0 | 92.632 |
| 927.0 | 92.617 |
| 926.0 | 92.614 |
| 925.0 | 92.632 |
| 924.0 | 92.638 |
| 923.0 | 92.673 |
| 922.0 | 92.639 |
| 921.0 | 92.614 |
| 920.0 | 92.63 |
| 919.0 | 92.604 |
| 918.0 | 92.584 |
| 917.0 | 92.616 |
| 916.0 | 92.626 |
| 915.0 | 92.607 |
| 914.0 | 92.609 |
| 913.0 | 92.608 |
| 912.0 | 92.585 |
| 911.0 | 92.585 |
| 910.0 | 92.603 |
| 909.0 | 92.586 |
| 908.0 | 92.607 |
| 907.0 | 92.608 |
| 906.0 | 92.61 |
| 905.0 | 92.638 |
| 904.0 | 92.628 |
| 903.0 | 92.595 |
| 902.0 | 92.582 |
| 901.0 | 92.583 |
| 900.0 | 92.586 |
| 899.0 | 92.591 |
| 898.0 | 92.592 |
| 897.0 | 92.577 |
| 896.0 | 92.589 |
| 895.0 | 92.605 |
| 894.0 | 92.608 |
| 893.0 | 92.605 |
| 892.0 | 92.602 |
| 891.0 | 92.621 |
| 890.0 | 92.62 |
| 889.0 | 92.603 |
| 888.0 | 92.593 |
| 887.0 | 92.59 |
| 886.0 | 92.598 |
| 885.0 | 92.596 |
| 884.0 | 92.586 |
| 883.0 | 92.579 |
| 882.0 | 92.582 |
| 881.0 | 92.579 |
| 880.0 | 92.564 |
| 879.0 | 92.569 |
| 878.0 | 92.58 |
| 877.0 | 92.587 |
| 876.0 | 92.594 |
| 875.0 | 92.607 |
| 874.0 | 92.608 |
| 873.0 | 92.599 |
| 872.0 | 92.588 |
| 871.0 | 92.578 |
| 870.0 | 92.575 |
| 869.0 | 92.576 |
| 868.0 | 92.584 |
| 867.0 | 92.588 |
| 866.0 | 92.593 |
| 865.0 | 92.572 |
| 864.0 | 92.57 |
| 863.0 | 92.594 |
| 862.0 | 92.586 |
| 861.0 | 92.566 |
| 860.0 | 92.314 |
| 859.0 | 92.158 |
| 858.0 | 92.147 |
| 857.0 | 92.151 |
| 856.0 | 92.133 |
| 855.0 | 92.154 |
| 854.0 | 92.187 |
| 853.0 | 92.167 |
| 852.0 | 92.142 |
| 851.0 | 92.145 |
| 850.0 | 92.164 |
| 849.0 | 92.194 |
| 848.0 | 92.206 |
| 847.0 | 92.138 |
| 846.0 | 92.123 |
| 845.0 | 92.196 |
| 844.0 | 92.216 |
| 843.0 | 92.198 |
| 842.0 | 92.187 |
| 841.0 | 92.144 |
| 840.0 | 92.134 |
| 839.0 | 92.189 |
| 838.0 | 92.2 |
| 837.0 | 92.166 |
| 836.0 | 92.166 |
| 835.0 | 92.158 |
| 834.0 | 92.147 |
| 833.0 | 92.159 |
| 832.0 | 92.157 |
| 831.0 | 92.179 |
| 830.0 | 92.172 |
| 829.0 | 92.154 |
| 828.0 | 92.155 |
| 827.0 | 92.168 |
| 826.0 | 92.156 |
| 825.0 | 92.171 |
| 824.0 | 92.176 |
| 823.0 | 92.164 |
| 822.0 | 92.168 |
| 821.0 | 92.172 |
| 820.0 | 92.149 |
| 819.0 | 92.171 |
| 818.0 | 92.191 |
| 817.0 | 92.143 |
| 816.0 | 92.171 |
| 815.0 | 92.202 |
| 814.0 | 92.149 |
| 813.0 | 92.18 |
| 812.0 | 92.191 |
| 811.0 | 92.164 |
| 810.0 | 92.171 |
| 809.0 | 92.18 |
| 808.0 | 92.143 |
| 807.0 | 92.158 |
| 806.0 | 92.171 |
| 805.0 | 92.145 |
| 804.0 | 92.169 |
| 803.0 | 92.164 |
| 802.0 | 92.161 |
| 801.0 | 92.173 |
| 800.0 | 92.177 |
| 799.0 | 92.158 |
| 798.0 | 92.186 |
| 797.0 | 92.191 |
| 796.0 | 92.173 |
| 795.0 | 92.182 |
| 794.0 | 92.183 |
| 793.0 | 92.141 |
| 792.0 | 92.157 |
| 791.0 | 92.188 |
| 790.0 | 92.177 |
| 789.0 | 92.183 |
| 788.0 | 92.185 |
| 787.0 | 92.163 |
| 786.0 | 92.158 |
| 785.0 | 92.172 |
| 784.0 | 92.169 |
| 783.0 | 92.175 |
| 782.0 | 92.197 |
| 781.0 | 92.165 |
| 780.0 | 92.169 |
| 779.0 | 92.181 |
| 778.0 | 92.166 |
| 777.0 | 92.182 |
| 776.0 | 92.19 |
| 775.0 | 92.167 |
| 774.0 | 92.192 |
| 773.0 | 92.186 |
| 772.0 | 92.154 |
| 771.0 | 92.182 |
| 770.0 | 92.197 |
| 769.0 | 92.158 |
| 768.0 | 92.183 |
| 767.0 | 92.18 |
| 766.0 | 92.128 |
| 765.0 | 92.165 |
| 764.0 | 92.189 |
| 763.0 | 92.133 |
| 762.0 | 92.174 |
| 761.0 | 92.165 |
| 760.0 | 92.156 |
| 759.0 | 92.217 |
| 758.0 | 92.195 |
| 757.0 | 92.154 |
| 756.0 | 92.177 |
| 755.0 | 92.181 |
| 754.0 | 92.143 |
| 753.0 | 92.194 |
| 752.0 | 92.214 |
| 751.0 | 92.17 |
| 750.0 | 92.182 |
| 749.0 | 92.186 |
| 748.0 | 92.154 |
| 747.0 | 92.209 |
| 746.0 | 92.213 |
| 745.0 | 92.153 |
| 744.0 | 92.164 |
| 743.0 | 92.19 |
| 742.0 | 92.148 |
| 741.0 | 92.186 |
| 740.0 | 92.174 |
| 739.0 | 92.135 |
| 738.0 | 92.168 |
| 737.0 | 92.168 |
| 736.0 | 92.131 |
| 735.0 | 92.183 |
| 734.0 | 92.176 |
| 733.0 | 92.149 |
| 732.0 | 92.156 |
| 731.0 | 92.158 |
| 730.0 | 92.137 |
| 729.0 | 92.169 |
| 728.0 | 92.163 |
| 727.0 | 92.137 |
| 726.0 | 92.17 |
| 725.0 | 92.181 |
| 724.0 | 92.138 |
| 723.0 | 92.191 |
| 722.0 | 92.193 |
| 721.0 | 92.123 |
| 720.0 | 92.142 |
| 719.0 | 92.177 |
| 718.0 | 92.1 |
| 717.0 | 92.18 |
| 716.0 | 92.176 |
| 715.0 | 92.129 |
| 714.0 | 92.126 |
| 713.0 | 92.156 |
| 712.0 | 92.112 |
| 711.0 | 92.166 |
| 710.0 | 92.174 |
| 709.0 | 92.112 |
| 708.0 | 92.151 |
| 707.0 | 92.149 |
| 706.0 | 92.099 |
| 705.0 | 92.162 |
| 704.0 | 92.151 |
| 703.0 | 92.081 |
| 702.0 | 92.139 |
| 701.0 | 92.151 |
| 700.0 | 92.108 |
| 699.0 | 92.162 |
| 698.0 | 92.155 |
| 697.0 | 92.094 |
| 696.0 | 92.136 |
| 695.0 | 92.135 |
| 694.0 | 92.132 |
| 693.0 | 92.151 |
| 692.0 | 92.103 |
| 691.0 | 92.111 |
| 690.0 | 92.131 |
| 689.0 | 92.122 |
| 688.0 | 92.057 |
| 687.0 | 92.104 |
| 686.0 | 92.134 |
| 685.0 | 92.075 |
| 684.0 | 92.119 |
| 683.0 | 92.121 |
| 682.0 | 92.057 |
| 681.0 | 92.087 |
| 680.0 | 92.103 |
| 679.0 | 92.085 |
| 678.0 | 92.135 |
| 677.0 | 92.116 |
| 676.0 | 92.037 |
| 675.0 | 92.1 |
| 674.0 | 92.107 |
| 673.0 | 92.044 |
| 672.0 | 92.094 |
| 671.0 | 92.089 |
| 670.0 | 92.023 |
| 669.0 | 92.088 |
| 668.0 | 92.086 |
| 667.0 | 92.049 |
| 666.0 | 92.076 |
| 665.0 | 92.065 |
| 664.0 | 91.992 |
| 663.0 | 92.043 |
| 662.0 | 92.065 |
| 661.0 | 92.005 |
| 660.0 | 92.056 |
| 659.0 | 92.026 |
| 658.0 | 91.998 |
| 657.0 | 92.028 |
| 656.0 | 92.042 |
| 655.0 | 91.969 |
| 654.0 | 92.044 |
| 653.0 | 92.023 |
| 652.0 | 91.979 |
| 651.0 | 92.008 |
| 650.0 | 92.015 |
| 649.0 | 91.976 |
| 648.0 | 92.038 |
| 647.0 | 92.028 |
| 646.0 | 91.977 |
| 645.0 | 92.012 |
| 644.0 | 92.029 |
| 643.0 | 92.008 |
| 642.0 | 92.032 |
| 641.0 | 92.004 |
| 640.0 | 91.969 |
| 639.0 | 92.018 |
| 638.0 | 92.03 |
| 637.0 | 91.98 |
| 636.0 | 92.035 |
| 635.0 | 92.035 |
| 634.0 | 91.964 |
| 633.0 | 92.024 |
| 632.0 | 92.036 |
| 631.0 | 91.992 |
| 630.0 | 92.042 |
| 629.0 | 92.024 |
| 628.0 | 91.962 |
| 627.0 | 92.004 |
| 626.0 | 92.048 |
| 625.0 | 92.019 |
| 624.0 | 92.024 |
| 623.0 | 92.006 |
| 622.0 | 91.979 |
| 621.0 | 92.043 |
| 620.0 | 92.052 |
| 619.0 | 91.99 |
| 618.0 | 92.028 |
| 617.0 | 92.02 |
| 616.0 | 91.977 |
| 615.0 | 92.043 |
| 614.0 | 92.044 |
| 613.0 | 91.997 |
| 612.0 | 92.03 |
| 611.0 | 92.021 |
| 610.0 | 91.976 |
| 609.0 | 92.04 |
| 608.0 | 92.042 |
| 607.0 | 91.993 |
| 606.0 | 92.043 |
| 605.0 | 92.024 |
| 604.0 | 92.017 |
| 603.0 | 92.045 |
| 602.0 | 92.02 |
| 601.0 | 92.021 |
| 600.0 | 92.043 |
| 599.0 | 92.01 |
| 598.0 | 91.975 |
| 597.0 | 92.01 |
| 596.0 | 92.026 |
| 595.0 | 92.006 |
| 594.0 | 92.038 |
| 593.0 | 92.016 |
| 592.0 | 91.992 |
| 591.0 | 92.06 |
| 590.0 | 92.037 |
| 589.0 | 92.004 |
| 588.0 | 92.032 |
| 587.0 | 92.02 |
| 586.0 | 91.978 |
| 585.0 | 92.013 |
| 584.0 | 92.048 |
| 583.0 | 92.027 |
| 582.0 | 92.028 |
| 581.0 | 91.994 |
| 580.0 | 91.986 |
| 579.0 | 92.038 |
| 578.0 | 92.025 |
| 577.0 | 92.001 |
| 576.0 | 92.039 |
| 575.0 | 92.017 |
| 574.0 | 91.987 |
| 573.0 | 92.03 |
| 572.0 | 92.023 |
| 571.0 | 92.002 |
| 570.0 | 92.036 |
| 569.0 | 92.012 |
| 568.0 | 91.975 |
| 567.0 | 92.014 |
| 566.0 | 92.02 |
| 565.0 | 91.995 |
| 564.0 | 92.017 |
| 563.0 | 92.008 |
| 562.0 | 91.999 |
| 561.0 | 91.999 |
| 560.0 | 91.98 |
| 559.0 | 92.005 |
| 558.0 | 92.008 |
| 557.0 | 91.978 |
| 556.0 | 91.999 |
| 555.0 | 91.979 |
| 554.0 | 91.967 |
| 553.0 | 92.013 |
| 552.0 | 91.997 |
| 551.0 | 91.968 |
| 550.0 | 91.985 |
| 549.0 | 91.97 |
| 548.0 | 91.96 |
| 547.0 | 92.008 |
| 546.0 | 91.991 |
| 545.0 | 91.954 |
| 544.0 | 91.974 |
| 543.0 | 91.962 |
| 542.0 | 91.968 |
| 541.0 | 92.028 |
| 540.0 | 91.999 |
| 539.0 | 91.959 |
| 538.0 | 91.983 |
| 537.0 | 91.963 |
| 536.0 | 91.963 |
| 535.0 | 92.006 |
| 534.0 | 91.975 |
| 533.0 | 91.936 |
| 532.0 | 91.957 |
| 531.0 | 91.943 |
| 530.0 | 91.948 |
| 529.0 | 91.984 |
| 528.0 | 91.955 |
| 527.0 | 91.931 |
| 526.0 | 91.952 |
| 525.0 | 91.928 |
| 524.0 | 91.93 |
| 523.0 | 91.963 |
| 522.0 | 91.932 |
| 521.0 | 91.909 |
| 520.0 | 91.932 |
| 519.0 | 91.931 |
| 518.0 | 91.93 |
| 517.0 | 91.939 |
| 516.0 | 91.903 |
| 515.0 | 91.888 |
| 514.0 | 91.915 |
| 513.0 | 91.906 |
| 512.0 | 91.898 |
| 511.0 | 91.934 |
| 510.0 | 91.91 |
| 509.0 | 91.878 |
| 508.0 | 91.893 |
| 507.0 | 91.881 |
| 506.0 | 91.872 |
| 505.0 | 91.903 |
| 504.0 | 91.88 |
| 503.0 | 91.847 |
| 502.0 | 91.866 |
| 501.0 | 91.84 |
| 500.0 | 91.843 |
| 499.0 | 91.885 |
| 498.0 | 91.846 |
| 497.0 | 91.812 |
| 496.0 | 91.827 |
| 495.0 | 91.814 |
| 494.0 | 91.82 |
| 493.0 | 91.826 |
| 492.0 | 91.778 |
| 491.0 | 91.769 |
| 490.0 | 91.784 |
| 489.0 | 91.762 |
| 488.0 | 91.776 |
| 487.0 | 91.809 |
| 486.0 | 91.767 |
| 485.0 | 91.741 |
| 484.0 | 91.76 |
| 483.0 | 91.734 |
| 482.0 | 91.753 |
| 481.0 | 91.779 |
| 480.0 | 91.73 |
| 479.0 | 91.712 |
| 478.0 | 91.73 |
| 477.0 | 91.711 |
| 476.0 | 91.729 |
| 475.0 | 91.754 |
| 474.0 | 91.715 |
| 473.0 | 91.694 |
| 472.0 | 91.711 |
| 471.0 | 91.695 |
| 470.0 | 91.712 |
| 469.0 | 91.746 |
| 468.0 | 91.705 |
| 467.0 | 91.689 |
| 466.0 | 91.701 |
| 465.0 | 91.674 |
| 464.0 | 91.682 |
| 463.0 | 91.72 |
| 462.0 | 91.688 |
| 461.0 | 91.668 |
| 460.0 | 91.675 |
| 459.0 | 91.656 |
| 458.0 | 91.677 |
| 457.0 | 91.704 |
| 456.0 | 91.661 |
| 455.0 | 91.645 |
| 454.0 | 91.655 |
| 453.0 | 91.629 |
| 452.0 | 91.658 |
| 451.0 | 91.678 |
| 450.0 | 91.621 |
| 449.0 | 91.611 |
| 448.0 | 91.621 |
| 447.0 | 91.596 |
| 446.0 | 91.638 |
| 445.0 | 91.669 |
| 444.0 | 91.609 |
| 443.0 | 91.603 |
| 442.0 | 91.62 |
| 441.0 | 91.59 |
| 440.0 | 91.63 |
| 439.0 | 91.66 |
| 438.0 | 91.613 |
| 437.0 | 91.606 |
| 436.0 | 91.623 |
| 435.0 | 91.591 |
| 434.0 | 91.626 |
| 433.0 | 91.637 |
| 432.0 | 91.588 |
| 431.0 | 91.591 |
| 430.0 | 91.62 |
| 429.0 | 91.599 |
| 428.0 | 91.638 |
| 427.0 | 91.683 |
| 426.0 | 91.612 |
| 425.0 | 91.591 |
| 424.0 | 91.617 |
| 423.0 | 91.592 |
| 422.0 | 91.612 |
| 421.0 | 91.653 |
| 420.0 | 91.641 |
| 419.0 | 91.616 |
| 418.0 | 91.622 |
| 417.0 | 91.59 |
| 416.0 | 91.618 |
| 415.0 | 91.645 |
| 414.0 | 91.613 |
| 413.0 | 91.62 |
| 412.0 | 91.625 |
| 411.0 | 91.587 |
| 410.0 | 91.626 |
| 409.0 | 91.637 |
| 408.0 | 91.59 |
| 407.0 | 91.6 |
| 406.0 | 91.613 |
| 405.0 | 91.576 |
| 404.0 | 91.611 |
| 403.0 | 91.65 |
| 402.0 | 91.601 |
| 401.0 | 91.594 |
| 400.0 | 91.606 |
| 399.0 | 91.559 |
| 398.0 | 91.572 |
| 397.0 | 91.591 |
| 396.0 | 91.541 |
| 395.0 | 91.528 |
| 394.0 | 91.51 |
| 393.0 | 91.471 |
| 392.0 | 91.489 |
| 391.0 | 91.484 |
| 390.0 | 91.426 |
| 389.0 | 91.406 |
| 388.0 | 91.385 |
| 387.0 | 91.298 |
| 386.0 | 91.329 |
| 385.0 | 91.309 |
| 384.0 | 91.202 |
| 383.0 | 91.174 |
| 382.0 | 91.154 |
| 381.0 | 91.059 |
| 380.0 | 91.056 |
| 379.0 | 91.052 |
| 378.0 | 90.985 |
| 377.0 | 90.966 |
| 376.0 | 90.981 |
| 375.0 | 90.999 |
| 374.0 | 90.959 |
| 373.0 | 90.972 |
| 372.0 | 90.959 |
| 371.0 | 90.913 |
| 370.0 | 90.925 |
| 369.0 | 90.928 |
| 368.0 | 90.859 |
| 367.0 | 90.835 |
| 366.0 | 90.784 |
| 365.0 | 90.684 |
| 364.0 | 90.677 |
| 363.0 | 90.637 |
| 362.0 | 90.562 |
| 361.0 | 90.509 |
| 360.0 | 90.421 |
| 359.0 | 90.31 |
| 358.0 | 90.281 |
| 357.0 | 90.207 |
| 356.0 | 90.04 |
| 355.0 | 89.963 |
| 354.0 | 89.872 |
| 353.0 | 89.727 |
| 352.0 | 89.639 |
| 351.0 | 89.533 |
| 350.0 | 89.336 |
| 349.0 | 89.201 |
| 348.0 | 89.054 |
| 347.0 | 88.834 |
| 346.0 | 88.699 |
| 345.0 | 88.521 |
| 344.0 | 88.243 |
| 343.0 | 88.036 |
| 342.0 | 87.797 |
| 341.0 | 87.519 |
| 340.0 | 87.234 |
| 339.0 | 87.002 |
| 338.0 | 86.599 |
| 337.0 | 86.281 |
| 336.0 | 85.908 |
| 335.0 | 85.459 |
| 334.0 | 85.096 |
| 333.0 | 84.678 |
| 332.0 | 84.133 |
| 331.0 | 83.653 |
| 330.0 | 83.066 |
| 329.0 | 82.408 |
| 328.0 | 81.809 |
| 327.0 | 81.09 |
| 326.0 | 80.282 |
| 325.0 | 79.525 |
| 324.0 | 78.669 |
| 323.0 | 77.727 |
| 322.0 | 76.815 |
| 321.0 | 75.782 |
| 320.0 | 74.603 |
| 319.0 | 73.412 |
| 318.0 | 72.182 |
| 317.0 | 70.775 |
| 316.0 | 69.348 |
| 315.0 | 67.872 |
| 314.0 | 66.252 |
| 313.0 | 64.632 |
| 312.0 | 62.852 |
| 311.0 | 60.966 |
| 310.0 | 59.031 |
| 309.0 | 56.98 |
| 308.0 | 54.802 |
| 307.0 | 52.592 |
| 306.0 | 50.302 |
| 305.0 | 47.965 |
| 304.0 | 45.569 |
| 303.0 | 43.178 |
| 302.0 | 40.728 |
| 301.0 | 38.204 |
| 300.0 | 35.646 |
| 299.0 | 33.033 |
| 298.0 | 30.474 |
| 297.0 | 27.923 |
| 296.0 | 25.453 |
| 295.0 | 23.052 |
| 294.0 | 20.756 |
| 293.0 | 18.565 |
| 292.0 | 16.457 |
| 291.0 | 14.46 |
| 290.0 | 12.559 |
| 289.0 | 10.776 |
| 288.0 | 9.162 |
| 287.0 | 7.689 |
| 286.0 | 6.385 |
| 285.0 | 5.255 |
| 284.0 | 4.261 |
| 283.0 | 3.429 |
| 282.0 | 2.705 |
| 281.0 | 2.102 |
| 280.0 | 1.601 |
| 279.0 | 1.192 |
| 278.0 | 0.867 |
| 277.0 | 0.626 |
| 276.0 | 0.437 |
| 275.0 | 0.3 |
| 274.0 | 0.204 |
| 273.0 | 0.139 |
| 272.0 | 0.085 |
| 271.0 | 0.058 |
| 270.0 | 0.032 |
| 269.0 | 0.02 |
| 268.0 | 0.011 |
| 267.0 | 0.009 |
| 266.0 | 0 |
| 265.0 | 0.005 |
| 264.0 | 0.001 |
| 263.0 | -0.001 |
| 262.0 | 0 |
| 261.0 | 0 |
| 260.0 | -0.002 |
| 259.0 | 0.003 |
| 258.0 | 0.002 |
| 257.0 | -0.001 |
| 256.0 | 0 |
| 255.0 | 0.002 |
| 254.0 | -0.002 |
| 253.0 | 0.002 |
| 252.0 | 0.002 |
| 251.0 | 0 |
| 250.0 | 0.001 |
| 249.0 | 0.002 |
| 248.0 | -0.001 |
| 247.0 | 0.004 |
| 246.0 | 0.002 |
| 245.0 | 0.001 |
| 244.0 | 0.002 |
| 243.0 | 0.003 |
| 242.0 | 0.001 |
| 241.0 | 0.004 |
| 240.0 | 0.004 |
| 239.0 | 0.003 |
| 238.0 | 0.005 |
| 237.0 | 0.007 |
| 236.0 | 0.003 |
| 235.0 | 0.008 |
| 234.0 | 0.008 |
| 233.0 | 0.006 |
| 232.0 | 0.007 |
| 231.0 | 0.009 |
| 230.0 | 0.006 |
| 229.0 | 0.01 |
| 228.0 | 0.009 |
| 227.0 | 0.007 |
| 226.0 | 0.008 |
| 225.0 | 0.008 |
| 224.0 | 0.006 |
| 223.0 | 0.01 |
| 222.0 | 0.008 |
| 221.0 | 0.006 |
| 220.0 | 0.007 |
| 219.0 | 0.008 |
| 218.0 | 0.004 |
| 217.0 | 0.008 |
| 216.0 | 0.006 |
| 215.0 | 0.004 |
| 214.0 | 0.004 |
| 213.0 | 0.006 |
| 212.0 | 0.003 |
| 211.0 | 0.006 |
| 210.0 | 0.004 |
| 209.0 | 0.002 |
| 208.0 | 0.004 |
| 207.0 | 0.003 |
| 206.0 | -0.001 |
| 205.0 | 0.004 |
| 204.0 | 0.003 |
| 203.0 | 0.001 |
| 202.0 | 0.003 |
| 201.0 | 0.003 |
| 200.0 | 0 |